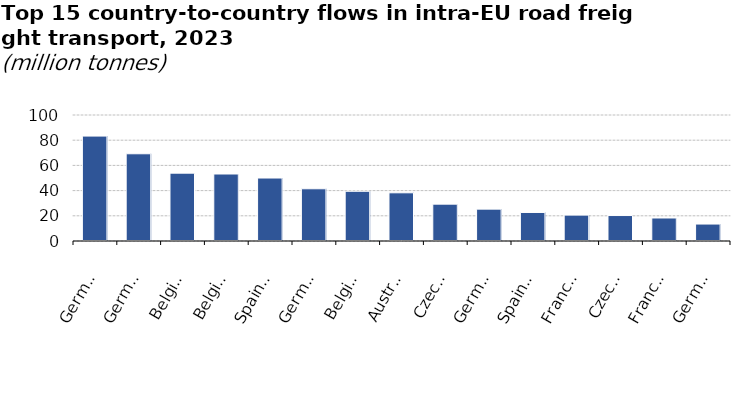
| Category | Series 0 |
|---|---|
| Germany-Netherlands | 83.265 |
| Germany-Poland | 69.225 |
| Belgium-France | 53.842 |
| Belgium-Netherlands | 53.165 |
| Spain-France | 49.977 |
| Germany-France | 41.455 |
| Belgium-Germany | 39.461 |
| Austria-Germany | 38.256 |
| Czechia-Germany | 29.256 |
| Germany-Italy | 25.274 |
| Spain-Portugal | 22.637 |
| France-Italy | 20.555 |
| Czechia-Poland | 20.212 |
| France-Netherlands | 18.263 |
| Germany-Spain | 13.464 |